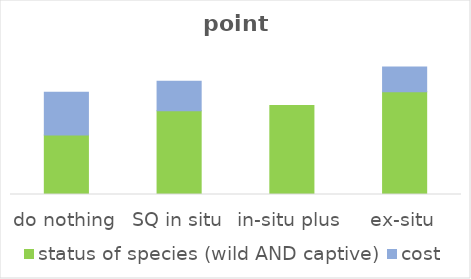
| Category | status of species (wild AND captive) | cost |
|---|---|---|
| do nothing | 0.319 | 0.231 |
| SQ in situ | 0.45 | 0.158 |
| in-situ plus | 0.478 | 0 |
| ex-situ | 0.552 | 0.132 |